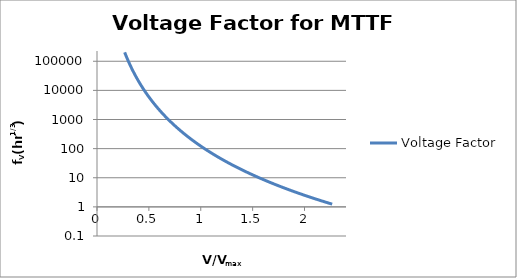
| Category | Voltage Factor |
|---|---|
| 0.2666667 | 202247.786 |
| 0.28 | 153834.657 |
| 0.2933333 | 118509.618 |
| 0.3066667 | 92361.353 |
| 0.32 | 72750.394 |
| 0.33333329999999994 | 57864.529 |
| 0.34666670000000005 | 46439.705 |
| 0.36 | 37581.318 |
| 0.3733333 | 30647.69 |
| 0.38666670000000003 | 25172.829 |
| 0.4 | 20814.405 |
| 0.41333329999999996 | 17318.234 |
| 0.4266667 | 14493.688 |
| 0.44 | 12196.461 |
| 0.45333329999999994 | 10316.354 |
| 0.46666670000000005 | 8768.522 |
| 0.48 | 7487.133 |
| 0.4933333 | 6420.735 |
| 0.5066667 | 5528.834 |
| 0.52 | 4779.359 |
| 0.5333333 | 4146.747 |
| 0.5466667000000001 | 3610.506 |
| 0.56 | 3154.118 |
| 0.5733332999999999 | 2764.196 |
| 0.5866667 | 2429.838 |
| 0.6 | 2142.122 |
| 0.6133333 | 1893.713 |
| 0.6266667 | 1678.554 |
| 0.64 | 1491.623 |
| 0.6533333 | 1328.741 |
| 0.6666667 | 1186.414 |
| 0.68 | 1061.711 |
| 0.6933333 | 952.167 |
| 0.7066667 | 855.699 |
| 0.72 | 770.541 |
| 0.7333333000000001 | 695.194 |
| 0.7466667 | 628.379 |
| 0.76 | 569.002 |
| 0.7733333 | 516.126 |
| 0.7866666999999999 | 468.945 |
| 0.8 | 426.764 |
| 0.8133333 | 388.983 |
| 0.8266667 | 355.081 |
| 0.84 | 324.607 |
| 0.8533333000000001 | 297.168 |
| 0.8666667 | 272.422 |
| 0.88 | 250.068 |
| 0.8933333 | 229.844 |
| 0.9066666999999999 | 211.519 |
| 0.92 | 194.892 |
| 0.9333333 | 179.784 |
| 0.9466667 | 166.036 |
| 0.96 | 153.511 |
| 0.9733333000000001 | 142.084 |
| 0.9866667 | 131.646 |
| 1.0 | 122.1 |
| 1.0133333 | 113.359 |
| 1.0266667 | 105.346 |
| 1.04 | 97.993 |
| 1.0533333 | 91.236 |
| 1.0666666999999999 | 85.022 |
| 1.08 | 79.301 |
| 1.0933333 | 74.027 |
| 1.1066667 | 69.162 |
| 1.12 | 64.67 |
| 1.1333333 | 60.517 |
| 1.1466667 | 56.675 |
| 1.16 | 53.117 |
| 1.1733333000000001 | 49.82 |
| 1.1866667 | 46.761 |
| 1.2 | 43.921 |
| 1.2133333 | 41.282 |
| 1.2266667 | 38.827 |
| 1.24 | 36.543 |
| 1.2533333 | 34.416 |
| 1.2666667 | 32.433 |
| 1.28 | 30.583 |
| 1.2933332999999998 | 28.857 |
| 1.3066667 | 27.244 |
| 1.32 | 25.736 |
| 1.3333332999999998 | 24.325 |
| 1.3466667 | 23.005 |
| 1.36 | 21.769 |
| 1.3733332999999999 | 20.61 |
| 1.3866667000000001 | 19.523 |
| 1.4 | 18.502 |
| 1.4133333 | 17.545 |
| 1.4266667000000002 | 16.645 |
| 1.44 | 15.799 |
| 1.4533333 | 15.003 |
| 1.4666667000000002 | 14.254 |
| 1.48 | 13.548 |
| 1.4933333 | 12.884 |
| 1.5066667 | 12.257 |
| 1.52 | 11.666 |
| 1.5333332999999998 | 11.109 |
| 1.5466667 | 10.582 |
| 1.56 | 10.085 |
| 1.5733332999999998 | 9.615 |
| 1.5866667 | 9.17 |
| 1.6 | 8.75 |
| 1.6133332999999999 | 8.352 |
| 1.6266667000000001 | 7.975 |
| 1.64 | 7.619 |
| 1.6533333 | 7.28 |
| 1.6666667000000002 | 6.96 |
| 1.68 | 6.656 |
| 1.6933333 | 6.367 |
| 1.7066667000000002 | 6.093 |
| 1.72 | 5.833 |
| 1.7333333 | 5.586 |
| 1.7466667 | 5.351 |
| 1.76 | 5.127 |
| 1.7733333 | 4.915 |
| 1.7866667 | 4.713 |
| 1.8 | 4.52 |
| 1.8133332999999998 | 4.337 |
| 1.8266667 | 4.162 |
| 1.84 | 3.996 |
| 1.8533332999999999 | 3.837 |
| 1.8666667000000001 | 3.686 |
| 1.88 | 3.542 |
| 1.8933332999999999 | 3.404 |
| 1.9066667000000002 | 3.273 |
| 1.92 | 3.147 |
| 1.9333333 | 3.028 |
| 1.9466667000000002 | 2.913 |
| 1.96 | 2.804 |
| 1.9733333 | 2.699 |
| 1.9866667 | 2.599 |
| 2.0 | 2.503 |
| 2.0133332999999998 | 2.412 |
| 2.0266667000000003 | 2.324 |
| 2.04 | 2.24 |
| 2.0533333 | 2.16 |
| 2.0666667000000003 | 2.083 |
| 2.08 | 2.009 |
| 2.0933333 | 1.938 |
| 2.1066667 | 1.871 |
| 2.12 | 1.806 |
| 2.1333333 | 1.743 |
| 2.1466667 | 1.683 |
| 2.16 | 1.626 |
| 2.1733333 | 1.571 |
| 2.1866667 | 1.518 |
| 2.2 | 1.467 |
| 2.2133333 | 1.418 |
| 2.2266667 | 1.371 |
| 2.24 | 1.326 |
| 2.2533333 | 1.283 |
| 2.2666667 | 1.241 |